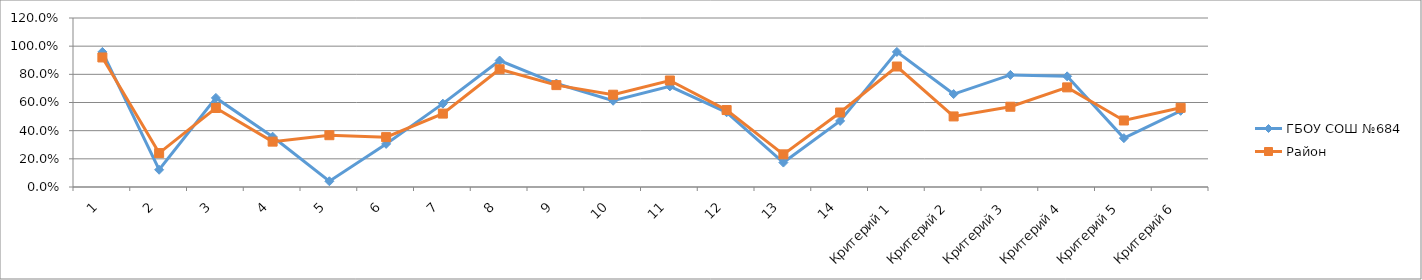
| Category | ГБОУ СОШ №684 | Район |
|---|---|---|
| 1 | 0.959 | 0.92 |
| 2 | 0.122 | 0.241 |
| 3 | 0.633 | 0.561 |
| 4 | 0.357 | 0.322 |
| 5 | 0.041 | 0.368 |
| 6 | 0.306 | 0.354 |
| 7 | 0.592 | 0.521 |
| 8 | 0.898 | 0.836 |
| 9 | 0.735 | 0.723 |
| 10 | 0.612 | 0.655 |
| 11 | 0.714 | 0.756 |
| 12 | 0.531 | 0.546 |
| 13 | 0.173 | 0.232 |
| 14 | 0.469 | 0.529 |
| Критерий 1 | 0.959 | 0.855 |
| Критерий 2 | 0.66 | 0.501 |
| Критерий 3 | 0.796 | 0.57 |
| Критерий 4 | 0.786 | 0.707 |
| Критерий 5 | 0.347 | 0.472 |
| Критерий 6 | 0.541 | 0.562 |